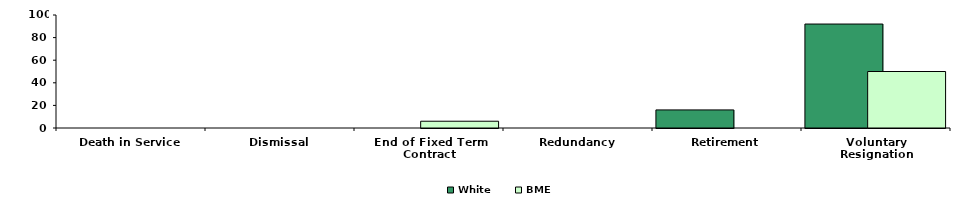
| Category | White | BME |
|---|---|---|
| Death in Service | 0 | 0 |
| Dismissal | 0 | 0 |
| End of Fixed Term Contract | 0 | 6 |
| Redundancy | 0 | 0 |
| Retirement | 16 | 0 |
| Voluntary Resignation | 92 | 50 |